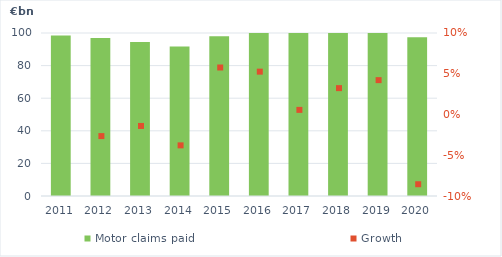
| Category | Motor claims paid |
|---|---|
| 2011.0 | 98.466 |
| 2012.0 | 96.867 |
| 2013.0 | 94.491 |
| 2014.0 | 91.647 |
| 2015.0 | 97.936 |
| 2016.0 | 101.033 |
| 2017.0 | 100.513 |
| 2018.0 | 102.818 |
| 2019.0 | 107.336 |
| 2020.0 | 97.364 |